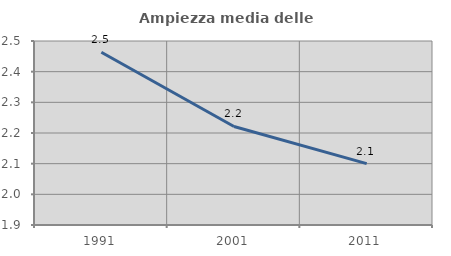
| Category | Ampiezza media delle famiglie |
|---|---|
| 1991.0 | 2.463 |
| 2001.0 | 2.221 |
| 2011.0 | 2.1 |